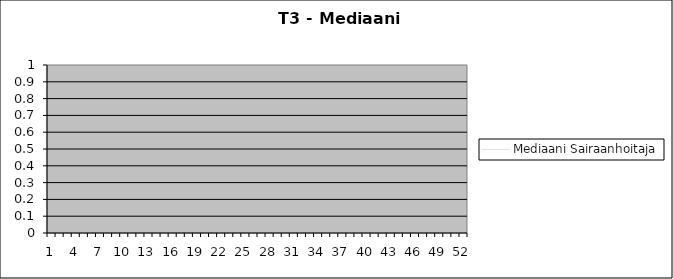
| Category | Mediaani Sairaanhoitaja |
|---|---|
| 0 | 0 |
| 1 | 0 |
| 2 | 0 |
| 3 | 0 |
| 4 | 0 |
| 5 | 0 |
| 6 | 0 |
| 7 | 0 |
| 8 | 0 |
| 9 | 0 |
| 10 | 0 |
| 11 | 0 |
| 12 | 0 |
| 13 | 0 |
| 14 | 0 |
| 15 | 0 |
| 16 | 0 |
| 17 | 0 |
| 18 | 0 |
| 19 | 0 |
| 20 | 0 |
| 21 | 0 |
| 22 | 0 |
| 23 | 0 |
| 24 | 0 |
| 25 | 0 |
| 26 | 0 |
| 27 | 0 |
| 28 | 0 |
| 29 | 0 |
| 30 | 0 |
| 31 | 0 |
| 32 | 0 |
| 33 | 0 |
| 34 | 0 |
| 35 | 0 |
| 36 | 0 |
| 37 | 0 |
| 38 | 0 |
| 39 | 0 |
| 40 | 0 |
| 41 | 0 |
| 42 | 0 |
| 43 | 0 |
| 44 | 0 |
| 45 | 0 |
| 46 | 0 |
| 47 | 0 |
| 48 | 0 |
| 49 | 0 |
| 50 | 0 |
| 51 | 0 |